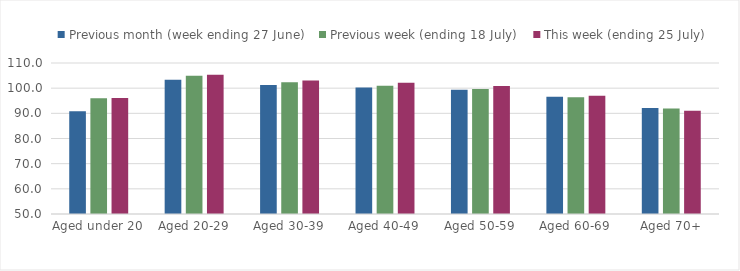
| Category | Previous month (week ending 27 June) | Previous week (ending 18 July) | This week (ending 25 July) |
|---|---|---|---|
| Aged under 20 | 90.788 | 96.001 | 96.082 |
| Aged 20-29 | 103.359 | 104.979 | 105.308 |
| Aged 30-39 | 101.29 | 102.318 | 103.094 |
| Aged 40-49 | 100.282 | 100.926 | 102.157 |
| Aged 50-59 | 99.354 | 99.681 | 100.882 |
| Aged 60-69 | 96.552 | 96.425 | 97.014 |
| Aged 70+ | 92.105 | 91.94 | 91.069 |